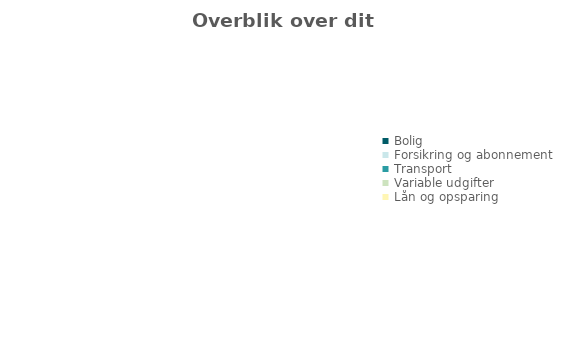
| Category | Series 0 |
|---|---|
| Bolig | 0 |
| Forsikring og abonnement | 0 |
| Transport | 0 |
| Variable udgifter | 0 |
| Lån og opsparing | 0 |